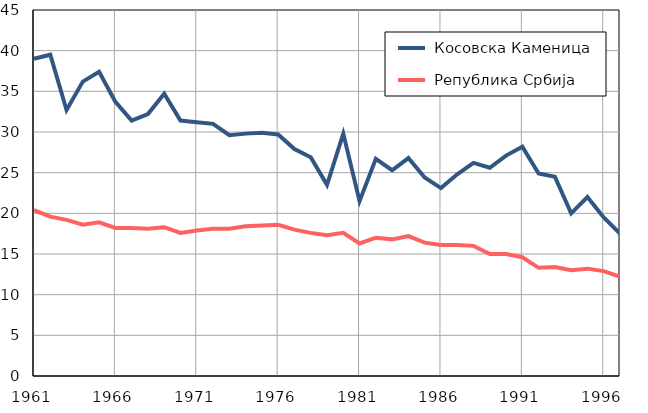
| Category |  Косовска Каменица |  Република Србија |
|---|---|---|
| 1961.0 | 39 | 20.4 |
| 1962.0 | 39.5 | 19.6 |
| 1963.0 | 32.7 | 19.2 |
| 1964.0 | 36.2 | 18.6 |
| 1965.0 | 37.4 | 18.9 |
| 1966.0 | 33.7 | 18.2 |
| 1967.0 | 31.4 | 18.2 |
| 1968.0 | 32.2 | 18.1 |
| 1969.0 | 34.7 | 18.3 |
| 1970.0 | 31.4 | 17.6 |
| 1971.0 | 31.2 | 17.9 |
| 1972.0 | 31 | 18.1 |
| 1973.0 | 29.6 | 18.1 |
| 1974.0 | 29.8 | 18.4 |
| 1975.0 | 29.9 | 18.5 |
| 1976.0 | 29.7 | 18.6 |
| 1977.0 | 27.9 | 18 |
| 1978.0 | 26.9 | 17.6 |
| 1979.0 | 23.5 | 17.3 |
| 1980.0 | 29.8 | 17.6 |
| 1981.0 | 21.5 | 16.3 |
| 1982.0 | 26.7 | 17 |
| 1983.0 | 25.3 | 16.8 |
| 1984.0 | 26.8 | 17.2 |
| 1985.0 | 24.4 | 16.4 |
| 1986.0 | 23.1 | 16.1 |
| 1987.0 | 24.8 | 16.1 |
| 1988.0 | 26.2 | 16 |
| 1989.0 | 25.6 | 15 |
| 1990.0 | 27.1 | 15 |
| 1991.0 | 28.2 | 14.6 |
| 1992.0 | 24.9 | 13.3 |
| 1993.0 | 24.5 | 13.4 |
| 1994.0 | 20 | 13 |
| 1995.0 | 22 | 13.2 |
| 1996.0 | 19.5 | 12.9 |
| 1997.0 | 17.5 | 12.2 |